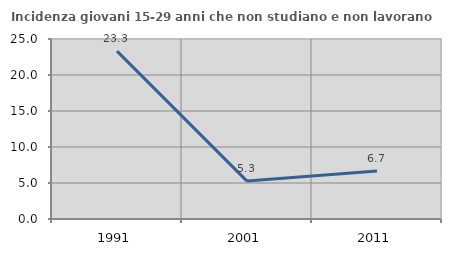
| Category | Incidenza giovani 15-29 anni che non studiano e non lavorano  |
|---|---|
| 1991.0 | 23.319 |
| 2001.0 | 5.263 |
| 2011.0 | 6.667 |